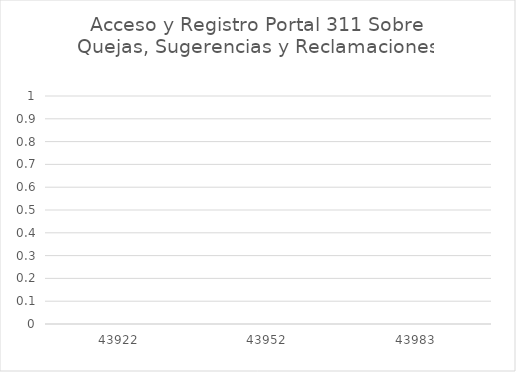
| Category | Series 0 |
|---|---|
| 43922.0 | 0 |
| 43952.0 | 0 |
| 43983.0 | 0 |